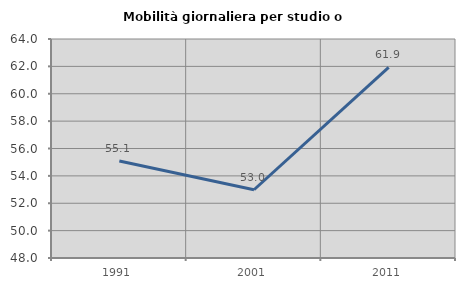
| Category | Mobilità giornaliera per studio o lavoro |
|---|---|
| 1991.0 | 55.081 |
| 2001.0 | 52.986 |
| 2011.0 | 61.934 |